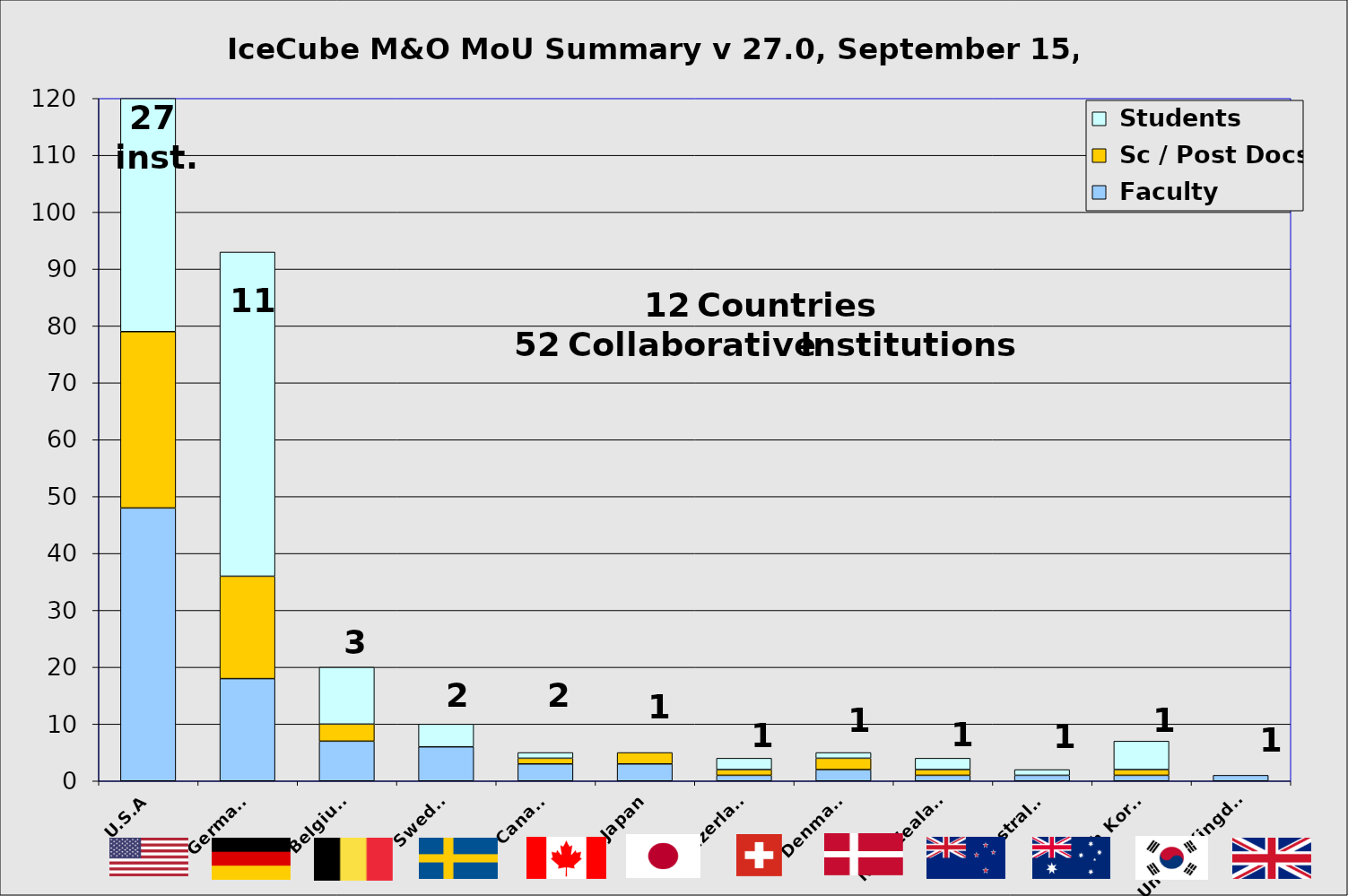
| Category |  Faculty |  Sc / Post Docs |  Students |
|---|---|---|---|
| U.S.A | 48 | 31 | 50 |
| Germany | 18 | 18 | 57 |
| Belgium | 7 | 3 | 10 |
| Sweden | 6 | 0 | 4 |
| Canada | 3 | 1 | 1 |
| Japan | 3 | 2 | 0 |
| Switzerland | 1 | 1 | 2 |
| Denmark | 2 | 2 | 1 |
| New Zealand | 1 | 1 | 2 |
| Australia | 1 | 0 | 1 |
| South Korea | 1 | 1 | 5 |
| United Kingdom | 1 | 0 | 0 |